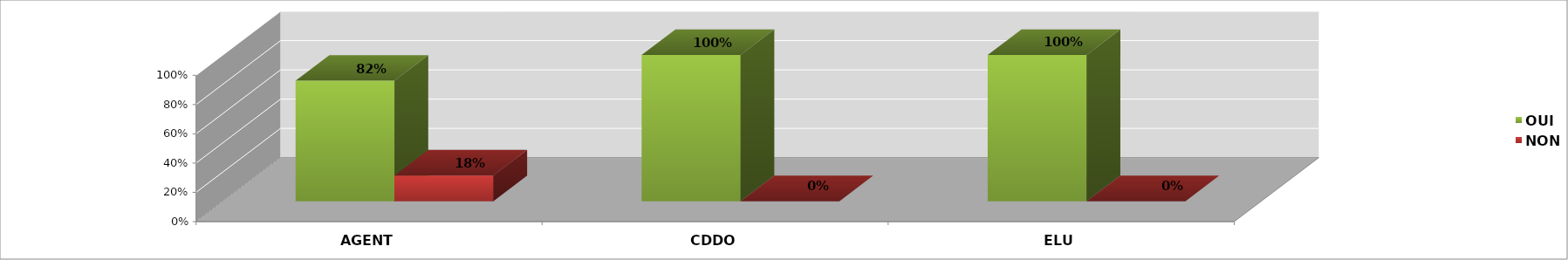
| Category | OUI | NON |
|---|---|---|
| AGENT | 0.824 | 0.176 |
| CDDO | 1 | 0 |
| ELU | 1 | 0 |